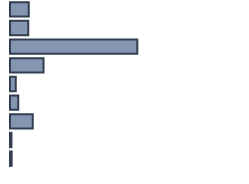
| Category | Series 0 |
|---|---|
| 0 | 7.93 |
| 1 | 7.684 |
| 2 | 53.49 |
| 3 | 14.116 |
| 4 | 2.459 |
| 5 | 3.478 |
| 6 | 9.55 |
| 7 | 0.611 |
| 8 | 0.682 |